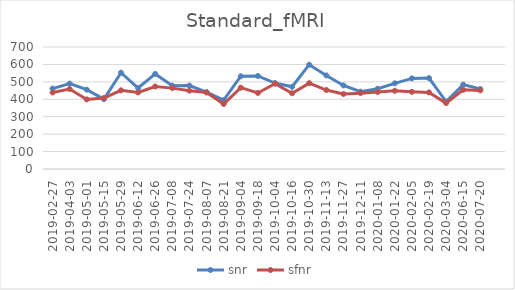
| Category | snr | sfnr |
|---|---|---|
| 2019-02-27 | 461.432 | 438.729 |
| 2019-04-03 | 490.146 | 458.722 |
| 2019-05-01 | 455.075 | 399.248 |
| 2019-05-15 | 400.65 | 407.241 |
| 2019-05-29 | 552.399 | 451.379 |
| 2019-06-12 | 464.698 | 439.009 |
| 2019-06-26 | 545.666 | 473.433 |
| 2019-07-08 | 478.159 | 464.034 |
| 2019-07-24 | 478.738 | 449.484 |
| 2019-08-07 | 441.214 | 438.544 |
| 2019-08-21 | 394.793 | 373.033 |
| 2019-09-04 | 532.233 | 466.613 |
| 2019-09-18 | 533.837 | 436.23 |
| 2019-10-04 | 493.005 | 489.764 |
| 2019-10-16 | 471.715 | 434.766 |
| 2019-10-30 | 598.517 | 492.395 |
| 2019-11-13 | 536.842 | 453.083 |
| 2019-11-27 | 479.42 | 430.281 |
| 2019-12-11 | 443.791 | 435.315 |
| 2020-01-08 | 460.467 | 441.715 |
| 2020-01-22 | 491.578 | 448.905 |
| 2020-02-05 | 519.903 | 442.596 |
| 2020-02-19 | 521.603 | 439.303 |
| 2020-03-04 | 386.86 | 378.362 |
| 2020-06-15 | 484.283 | 454.371 |
| 2020-07-20 | 459.078 | 451.037 |